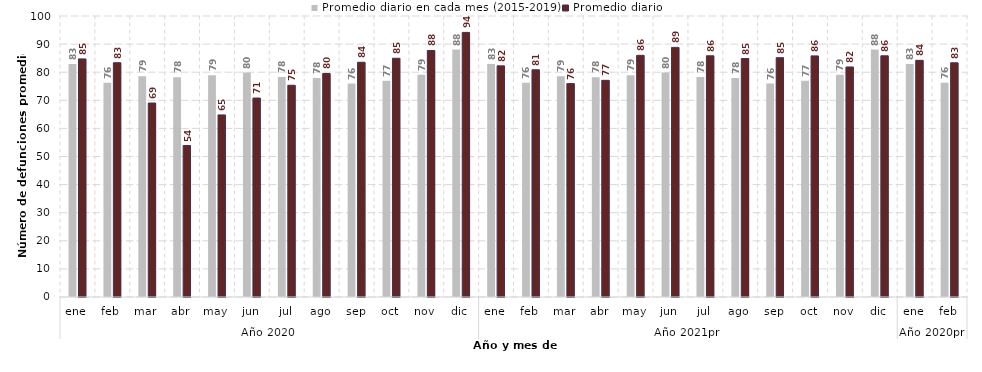
| Category | Promedio diario en cada mes (2015-2019) | Promedio diario |
|---|---|---|
| 0 | 82.877 | 84.742 |
| 1 | 76.26 | 83.379 |
| 2 | 78.523 | 69.032 |
| 3 | 78.213 | 53.9 |
| 4 | 78.89 | 64.806 |
| 5 | 79.88 | 70.8 |
| 6 | 78.277 | 75.355 |
| 7 | 77.897 | 79.548 |
| 8 | 75.94 | 83.533 |
| 9 | 76.948 | 84.968 |
| 10 | 79.073 | 87.733 |
| 11 | 88.071 | 94.161 |
| 12 | 82.877 | 82.258 |
| 13 | 76.26 | 80.857 |
| 14 | 78.523 | 75.935 |
| 15 | 78.213 | 77.1 |
| 16 | 78.89 | 86 |
| 17 | 79.88 | 88.833 |
| 18 | 78.277 | 85.839 |
| 19 | 77.897 | 84.871 |
| 20 | 75.94 | 85.167 |
| 21 | 76.948 | 85.806 |
| 22 | 79.073 | 81.867 |
| 23 | 88.071 | 85.839 |
| 24 | 82.877 | 84.226 |
| 25 | 76.26 | 83.357 |